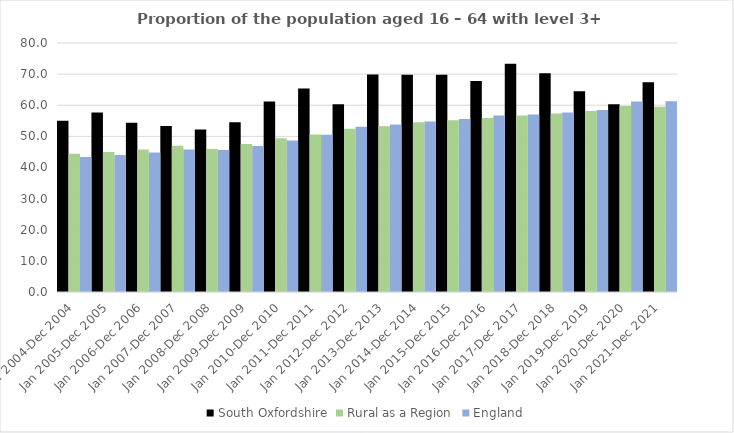
| Category | South Oxfordshire | Rural as a Region | England |
|---|---|---|---|
| Jan 2004-Dec 2004 | 55 | 44.405 | 43.4 |
| Jan 2005-Dec 2005 | 57.7 | 44.973 | 44 |
| Jan 2006-Dec 2006 | 54.4 | 45.774 | 44.8 |
| Jan 2007-Dec 2007 | 53.3 | 46.968 | 45.8 |
| Jan 2008-Dec 2008 | 52.2 | 45.964 | 45.6 |
| Jan 2009-Dec 2009 | 54.5 | 47.59 | 46.9 |
| Jan 2010-Dec 2010 | 61.2 | 49.362 | 48.7 |
| Jan 2011-Dec 2011 | 65.4 | 50.602 | 50.5 |
| Jan 2012-Dec 2012 | 60.3 | 52.439 | 53.1 |
| Jan 2013-Dec 2013 | 69.9 | 53.276 | 53.8 |
| Jan 2014-Dec 2014 | 69.8 | 54.57 | 54.8 |
| Jan 2015-Dec 2015 | 69.8 | 55.16 | 55.6 |
| Jan 2016-Dec 2016 | 67.8 | 55.941 | 56.7 |
| Jan 2017-Dec 2017 | 73.3 | 56.689 | 57 |
| Jan 2018-Dec 2018 | 70.3 | 57.389 | 57.7 |
| Jan 2019-Dec 2019 | 64.5 | 58.147 | 58.5 |
| Jan 2020-Dec 2020 | 60.3 | 59.771 | 61.2 |
| Jan 2021-Dec 2021 | 67.4 | 59.54 | 61.3 |